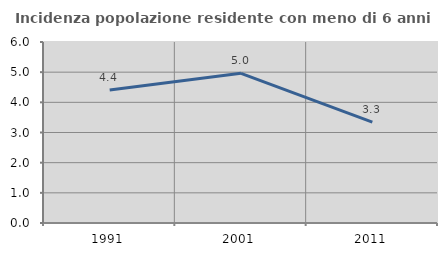
| Category | Incidenza popolazione residente con meno di 6 anni |
|---|---|
| 1991.0 | 4.408 |
| 2001.0 | 4.961 |
| 2011.0 | 3.343 |